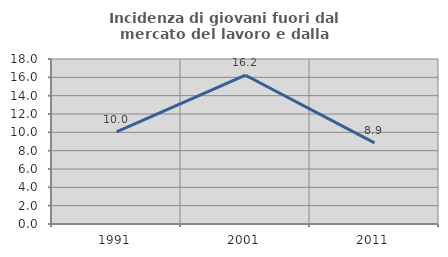
| Category | Incidenza di giovani fuori dal mercato del lavoro e dalla formazione  |
|---|---|
| 1991.0 | 10.046 |
| 2001.0 | 16.232 |
| 2011.0 | 8.856 |